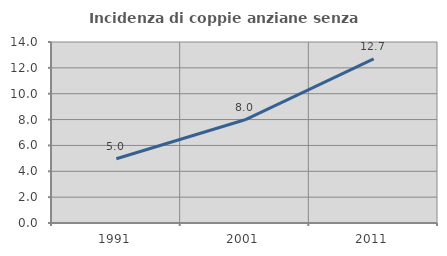
| Category | Incidenza di coppie anziane senza figli  |
|---|---|
| 1991.0 | 4.97 |
| 2001.0 | 7.983 |
| 2011.0 | 12.695 |